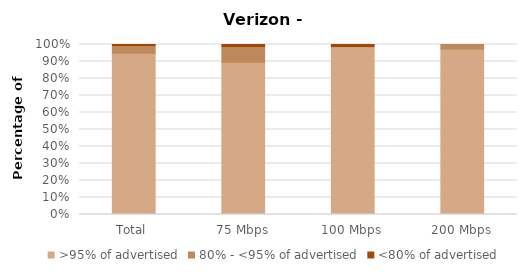
| Category | >95% of advertised | 80% - <95% of advertised | <80% of advertised |
|---|---|---|---|
| Total | 0.949 | 0.036 | 0.015 |
| 75 Mbps | 0.896 | 0.083 | 0.021 |
| 100 Mbps | 0.98 | 0 | 0.02 |
| 200 Mbps | 0.974 | 0.026 | 0 |